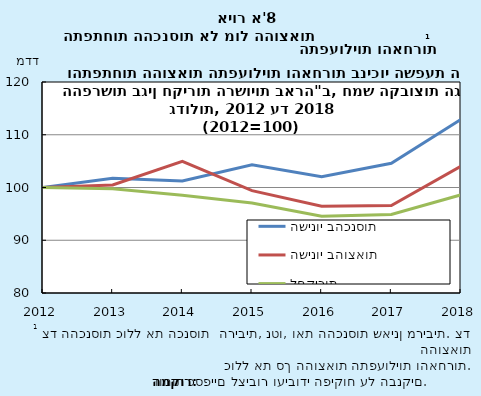
| Category | השינוי בהכנסות | השינוי בהוצאות | ההוצאות בניכוי ההפרשות לחקירות |
|---|---|---|---|
| 2012-12-31 | 100 | 100 | 100 |
| 2013-12-31 | 101.752 | 100.496 | 99.745 |
| 2014-12-31 | 101.254 | 104.952 | 98.527 |
| 2015-12-31 | 104.321 | 99.413 | 97.054 |
| 2016-12-31 | 102.056 | 96.432 | 94.542 |
| 2017-12-31 | 104.585 | 96.565 | 94.892 |
| 2018-12-31 | 112.935 | 104.033 | 98.618 |